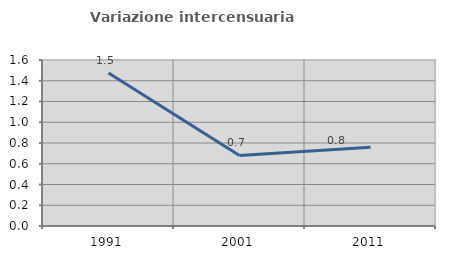
| Category | Variazione intercensuaria annua |
|---|---|
| 1991.0 | 1.474 |
| 2001.0 | 0.68 |
| 2011.0 | 0.758 |